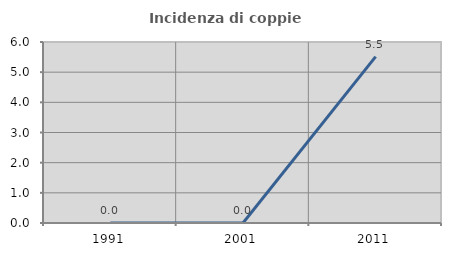
| Category | Incidenza di coppie miste |
|---|---|
| 1991.0 | 0 |
| 2001.0 | 0 |
| 2011.0 | 5.517 |